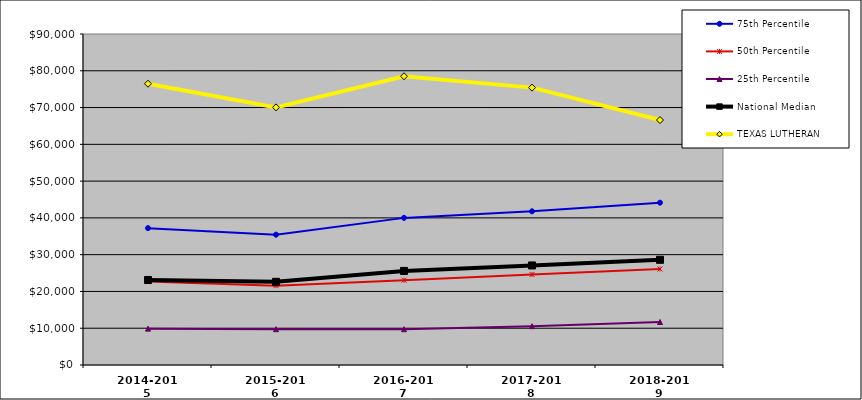
| Category | 75th Percentile | 50th Percentile | 25th Percentile | National Median | TEXAS LUTHERAN |
|---|---|---|---|---|---|
| 2014-2015 | 37214.268 | 22677.301 | 9887.97 | 23117.708 | 76478.341 |
| 2015-2016 | 35436.565 | 21572.983 | 9734.56 | 22619.893 | 70047.888 |
| 2016-2017 | 40003.392 | 23057.422 | 9733.023 | 25581.053 | 78508.712 |
| 2017-2018 | 41795.136 | 24615.595 | 10565.198 | 27067.87 | 75423 |
| 2018-2019 | 44126.955 | 26115.103 | 11689.601 | 28604.166 | 66606.85 |